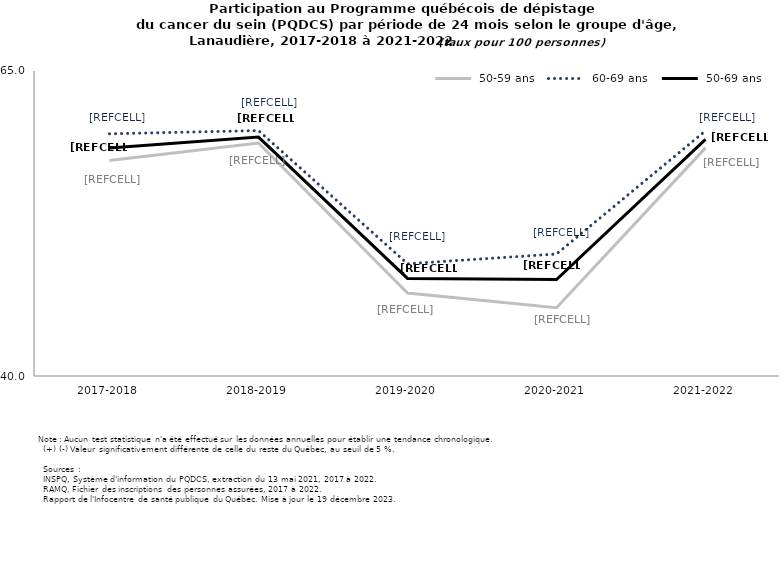
| Category |  50-59 ans |  60-69 ans |  50-69 ans |
|---|---|---|---|
| 2017-2018 | 57.668 | 59.852 | 58.686 |
| 2018-2019 | 59.098 | 60.116 | 59.586 |
| 2019-2020 | 46.8 | 49.2 | 48 |
| 2020-2021 | 45.6 | 50 | 47.9 |
| 2021-2022 | 58.7 | 60.1 | 59.4 |